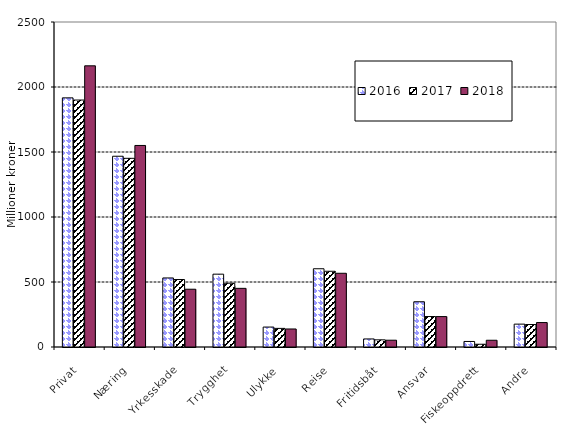
| Category | 2016 | 2017 | 2018 |
|---|---|---|---|
| Privat | 1916.538 | 1899.654 | 2162.865 |
| Næring | 1467.402 | 1451.331 | 1550.253 |
| Yrkesskade | 531.15 | 519.043 | 444.42 |
| Trygghet | 560.289 | 490.687 | 451.138 |
| Ulykke | 153.419 | 143.172 | 138.626 |
| Reise | 601.816 | 582.642 | 567.076 |
| Fritidsbåt | 61.956 | 55.114 | 52.284 |
| Ansvar | 348.152 | 234.477 | 233.938 |
| Fiskeoppdrett | 42.667 | 21.17 | 51.827 |
| Andre | 175.866 | 172.929 | 188.083 |